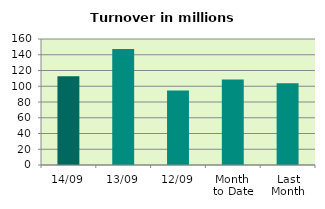
| Category | Series 0 |
|---|---|
| 14/09 | 112.833 |
| 13/09 | 147.427 |
| 12/09 | 94.473 |
| Month 
to Date | 108.443 |
| Last
Month | 103.765 |